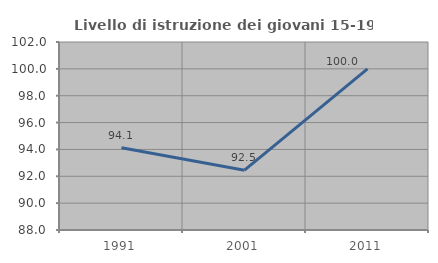
| Category | Livello di istruzione dei giovani 15-19 anni |
|---|---|
| 1991.0 | 94.118 |
| 2001.0 | 92.453 |
| 2011.0 | 100 |